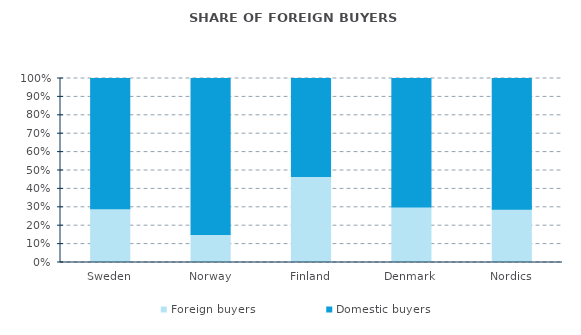
| Category | Foreign buyers | Domestic buyers |
|---|---|---|
| Sweden | 0.292 | 0.708 |
| Norway | 0.152 | 0.848 |
| Finland | 0.468 | 0.532 |
| Denmark | 0.302 | 0.698 |
| Nordics | 0.289 | 0.711 |